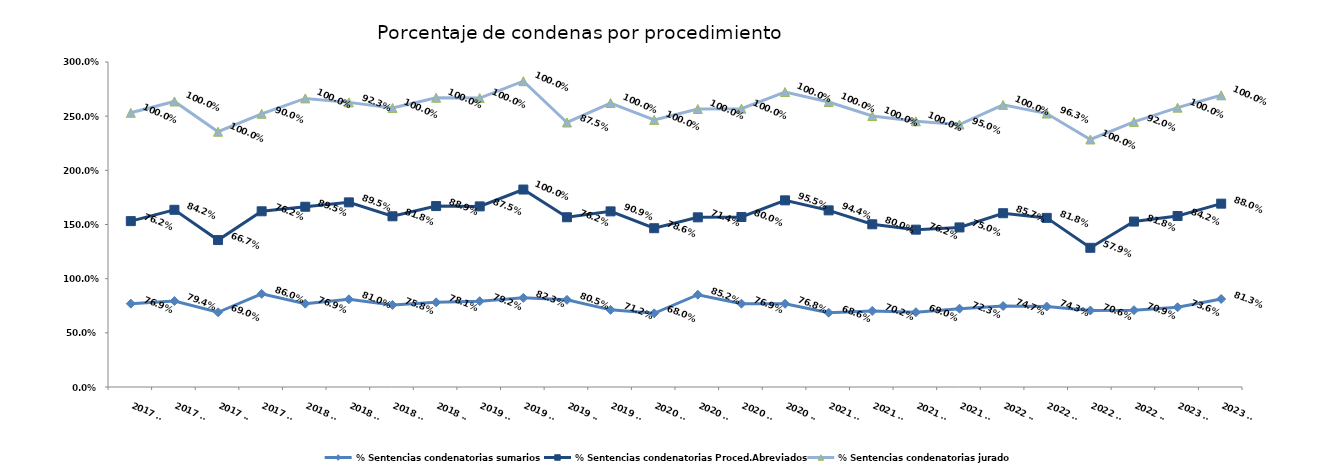
| Category | % Sentencias condenatorias sumarios | % Sentencias condenatorias Proced.Abreviados | % Sentencias condenatorias jurado |
|---|---|---|---|
| 2017 T1 | 0.769 | 0.762 | 1 |
| 2017 T2 | 0.794 | 0.842 | 1 |
| 2017 T3 | 0.69 | 0.667 | 1 |
| 2017 T4 | 0.86 | 0.762 | 0.9 |
| 2018 T1 | 0.769 | 0.895 | 1 |
| 2018 T2 | 0.81 | 0.895 | 0.923 |
| 2018 T3 | 0.758 | 0.818 | 1 |
| 2018 T4 | 0.781 | 0.889 | 1 |
| 2019 T1 | 0.792 | 0.875 | 1 |
| 2019 T2 | 0.823 | 1 | 1 |
| 2019 T3 | 0.805 | 0.762 | 0.875 |
| 2019 T4 | 0.712 | 0.909 | 1 |
| 2020 T1 | 0.68 | 0.786 | 1 |
| 2020 T2 | 0.852 | 0.714 | 1 |
| 2020 T3 | 0.769 | 0.8 | 1 |
| 2020 T4 | 0.768 | 0.955 | 1 |
| 2021 T1 | 0.686 | 0.944 | 1 |
| 2021 T2 | 0.702 | 0.8 | 1 |
| 2021 T3 | 0.69 | 0.762 | 1 |
| 2021 T4 | 0.723 | 0.75 | 0.95 |
| 2022 T1 | 0.747 | 0.857 | 1 |
| 2022 T2 | 0.743 | 0.818 | 0.963 |
| 2022 T3 | 0.706 | 0.579 | 1 |
| 2022 T4 | 0.709 | 0.818 | 0.92 |
| 2023 T1 | 0.736 | 0.842 | 1 |
| 2023 T2 | 0.812 | 0.88 | 1 |